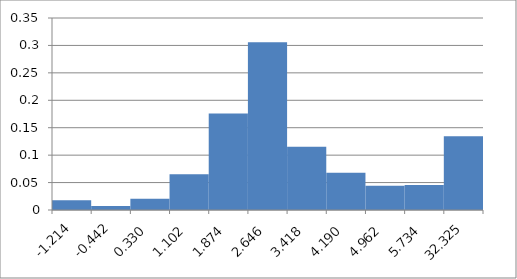
| Category | Series 0 |
|---|---|
| -1.213920031566634 | 0.018 |
| -0.4418917767884697 | 0.007 |
| 0.3301364779896947 | 0.021 |
| 1.102164732767859 | 0.065 |
| 1.8741929875460235 | 0.176 |
| 2.646221242324188 | 0.306 |
| 3.4182494971023525 | 0.115 |
| 4.190277751880517 | 0.068 |
| 4.9623060066586815 | 0.044 |
| 5.734334261436846 | 0.046 |
| 32.32537712581785 | 0.134 |